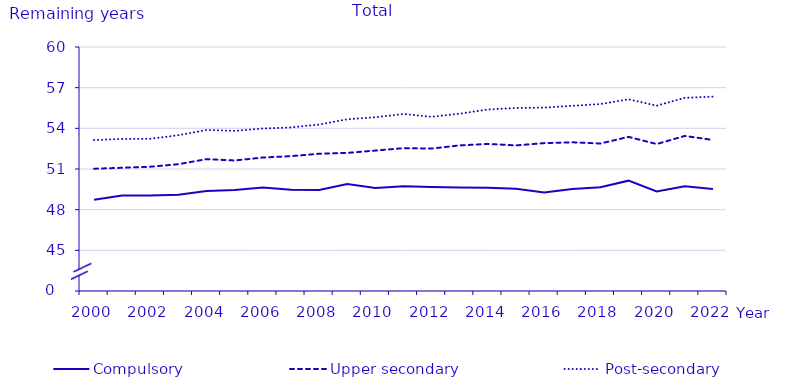
| Category | Compulsory | Upper secondary | Post-secondary |
|---|---|---|---|
| 2000.0 | 48.731 | 51.02 | 53.137 |
| 2001.0 | 49.05 | 51.09 | 53.215 |
| 2002.0 | 49.047 | 51.169 | 53.227 |
| 2003.0 | 49.095 | 51.354 | 53.494 |
| 2004.0 | 49.374 | 51.728 | 53.879 |
| 2005.0 | 49.45 | 51.628 | 53.812 |
| 2006.0 | 49.641 | 51.846 | 53.988 |
| 2007.0 | 49.465 | 51.948 | 54.069 |
| 2008.0 | 49.458 | 52.125 | 54.278 |
| 2009.0 | 49.886 | 52.189 | 54.669 |
| 2010.0 | 49.592 | 52.36 | 54.819 |
| 2011.0 | 49.723 | 52.538 | 55.057 |
| 2012.0 | 49.68 | 52.51 | 54.85 |
| 2013.0 | 49.63 | 52.74 | 55.08 |
| 2014.0 | 49.61 | 52.85 | 55.39 |
| 2015.0 | 49.54 | 52.74 | 55.5 |
| 2016.0 | 49.27 | 52.91 | 55.53 |
| 2017.0 | 49.53 | 52.97 | 55.66 |
| 2018.0 | 49.66 | 52.88 | 55.79 |
| 2019.0 | 50.14 | 53.37 | 56.14 |
| 2020.0 | 49.34 | 52.84 | 55.67 |
| 2021.0 | 49.72 | 53.44 | 56.25 |
| 2022.0 | 49.53 | 53.14 | 56.34 |